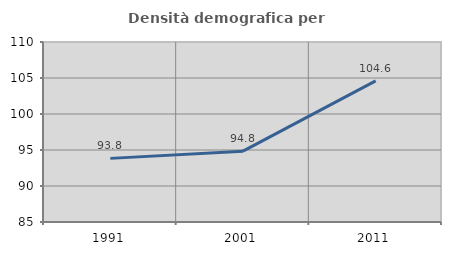
| Category | Densità demografica |
|---|---|
| 1991.0 | 93.837 |
| 2001.0 | 94.838 |
| 2011.0 | 104.597 |